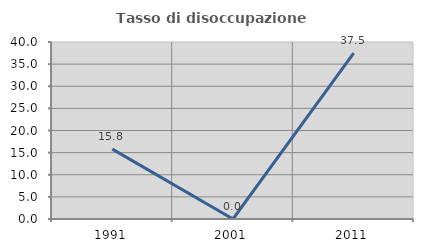
| Category | Tasso di disoccupazione giovanile  |
|---|---|
| 1991.0 | 15.789 |
| 2001.0 | 0 |
| 2011.0 | 37.5 |